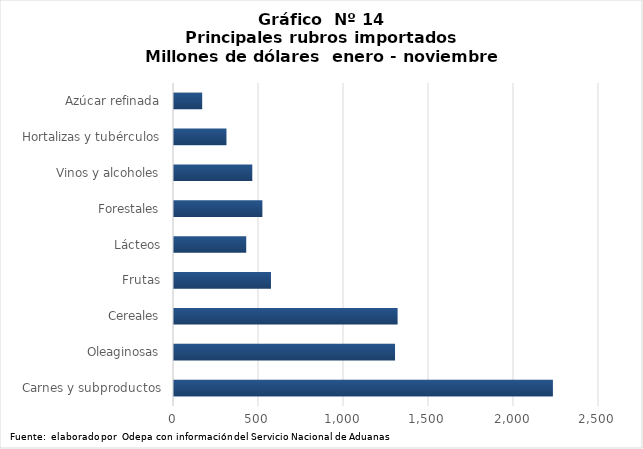
| Category | Series 0 |
|---|---|
| Carnes y subproductos | 2228829.806 |
| Oleaginosas | 1300225.252 |
| Cereales | 1315336.858 |
| Frutas | 570460.556 |
| Lácteos | 424809.093 |
| Forestales | 519987 |
| Vinos y alcoholes | 460499.972 |
| Hortalizas y tubérculos | 308624.347 |
| Azúcar refinada | 165878.235 |